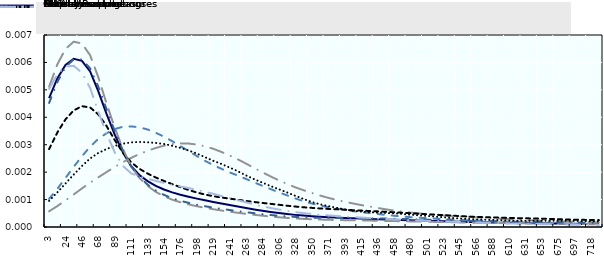
| Category | All ALMPs | Formal training | Non-formal training | Employment measures | MICs | Career consultations | Mobility support | Other measures |
|---|---|---|---|---|---|---|---|---|
| 2.5326633 | 0.005 | 0.001 | 0.001 | 0.003 | 0.005 | 0.005 | 0.001 | 0.005 |
| 13.376884 | 0.005 | 0.001 | 0.001 | 0.003 | 0.006 | 0.005 | 0.001 | 0.006 |
| 24.221106 | 0.006 | 0.002 | 0.001 | 0.004 | 0.006 | 0.006 | 0.002 | 0.006 |
| 35.065327 | 0.006 | 0.002 | 0.001 | 0.004 | 0.007 | 0.006 | 0.002 | 0.006 |
| 45.909548 | 0.006 | 0.003 | 0.001 | 0.004 | 0.007 | 0.006 | 0.002 | 0.006 |
| 56.753769 | 0.006 | 0.003 | 0.002 | 0.004 | 0.006 | 0.006 | 0.002 | 0.005 |
| 67.59799 | 0.005 | 0.003 | 0.002 | 0.004 | 0.005 | 0.005 | 0.003 | 0.004 |
| 78.442211 | 0.004 | 0.003 | 0.002 | 0.004 | 0.005 | 0.004 | 0.003 | 0.003 |
| 89.286432 | 0.003 | 0.004 | 0.002 | 0.003 | 0.004 | 0.003 | 0.003 | 0.003 |
| 100.13065 | 0.003 | 0.004 | 0.002 | 0.003 | 0.003 | 0.003 | 0.003 | 0.002 |
| 110.97487 | 0.002 | 0.004 | 0.003 | 0.002 | 0.002 | 0.002 | 0.003 | 0.002 |
| 121.8191 | 0.002 | 0.004 | 0.003 | 0.002 | 0.002 | 0.002 | 0.003 | 0.002 |
| 132.66332 | 0.002 | 0.004 | 0.003 | 0.002 | 0.002 | 0.002 | 0.003 | 0.002 |
| 143.50754 | 0.001 | 0.003 | 0.003 | 0.002 | 0.001 | 0.001 | 0.003 | 0.002 |
| 154.35176 | 0.001 | 0.003 | 0.003 | 0.002 | 0.001 | 0.001 | 0.003 | 0.002 |
| 165.19598 | 0.001 | 0.003 | 0.003 | 0.002 | 0.001 | 0.001 | 0.003 | 0.002 |
| 176.0402 | 0.001 | 0.003 | 0.003 | 0.001 | 0.001 | 0.001 | 0.003 | 0.001 |
| 186.88442 | 0.001 | 0.003 | 0.003 | 0.001 | 0.001 | 0.001 | 0.003 | 0.001 |
| 197.72864 | 0.001 | 0.003 | 0.003 | 0.001 | 0.001 | 0.001 | 0.003 | 0.001 |
| 208.57286 | 0.001 | 0.002 | 0.003 | 0.001 | 0.001 | 0.001 | 0.003 | 0.001 |
| 219.41709 | 0.001 | 0.002 | 0.003 | 0.001 | 0.001 | 0.001 | 0.002 | 0.001 |
| 230.26131 | 0.001 | 0.002 | 0.003 | 0.001 | 0.001 | 0.001 | 0.002 | 0.001 |
| 241.10553 | 0.001 | 0.002 | 0.003 | 0.001 | 0.001 | 0.001 | 0.002 | 0.001 |
| 251.94975 | 0.001 | 0.002 | 0.002 | 0.001 | 0.001 | 0.001 | 0.002 | 0.001 |
| 262.79397 | 0.001 | 0.002 | 0.002 | 0.001 | 0 | 0.001 | 0.002 | 0.001 |
| 273.63819 | 0.001 | 0.002 | 0.002 | 0.001 | 0 | 0.001 | 0.002 | 0.001 |
| 284.48241 | 0.001 | 0.002 | 0.002 | 0.001 | 0 | 0 | 0.002 | 0.001 |
| 295.32663 | 0.001 | 0.001 | 0.002 | 0.001 | 0 | 0 | 0.001 | 0.001 |
| 306.17085 | 0.001 | 0.001 | 0.002 | 0.001 | 0 | 0 | 0.001 | 0.001 |
| 317.01508 | 0 | 0.001 | 0.002 | 0.001 | 0 | 0 | 0.001 | 0.001 |
| 327.8593 | 0 | 0.001 | 0.001 | 0.001 | 0 | 0 | 0.001 | 0.001 |
| 338.70352 | 0 | 0.001 | 0.001 | 0.001 | 0 | 0 | 0.001 | 0.001 |
| 349.54774 | 0 | 0.001 | 0.001 | 0.001 | 0 | 0 | 0.001 | 0 |
| 360.39196 | 0 | 0.001 | 0.001 | 0.001 | 0 | 0 | 0.001 | 0 |
| 371.23618 | 0 | 0.001 | 0.001 | 0.001 | 0 | 0 | 0.001 | 0 |
| 382.0804 | 0 | 0.001 | 0.001 | 0.001 | 0 | 0 | 0.001 | 0 |
| 392.92462 | 0 | 0.001 | 0.001 | 0.001 | 0 | 0 | 0.001 | 0 |
| 403.76884 | 0 | 0.001 | 0.001 | 0.001 | 0 | 0 | 0.001 | 0 |
| 414.61307 | 0 | 0.001 | 0.001 | 0.001 | 0 | 0 | 0.001 | 0 |
| 425.45729 | 0 | 0.001 | 0.001 | 0.001 | 0 | 0 | 0.001 | 0 |
| 436.30151 | 0 | 0 | 0.001 | 0.001 | 0 | 0 | 0.001 | 0 |
| 447.14573 | 0 | 0 | 0.001 | 0.001 | 0 | 0 | 0.001 | 0 |
| 457.98995 | 0 | 0 | 0.001 | 0.001 | 0 | 0 | 0 | 0 |
| 468.83417 | 0 | 0 | 0.001 | 0.001 | 0 | 0 | 0 | 0 |
| 479.67839 | 0 | 0 | 0.001 | 0.001 | 0 | 0 | 0 | 0 |
| 490.52261 | 0 | 0 | 0 | 0 | 0 | 0 | 0 | 0 |
| 501.36683 | 0 | 0 | 0 | 0 | 0 | 0 | 0 | 0 |
| 512.21106 | 0 | 0 | 0 | 0 | 0 | 0 | 0 | 0 |
| 523.05528 | 0 | 0 | 0 | 0 | 0 | 0 | 0 | 0 |
| 533.8995 | 0 | 0 | 0 | 0 | 0 | 0 | 0 | 0 |
| 544.74372 | 0 | 0 | 0 | 0 | 0 | 0 | 0 | 0 |
| 555.58794 | 0 | 0 | 0 | 0 | 0 | 0 | 0 | 0 |
| 566.43216 | 0 | 0 | 0 | 0 | 0 | 0 | 0 | 0 |
| 577.27638 | 0 | 0 | 0 | 0 | 0 | 0 | 0 | 0 |
| 588.1206 | 0 | 0 | 0 | 0 | 0 | 0 | 0 | 0 |
| 598.96482 | 0 | 0 | 0 | 0 | 0 | 0 | 0 | 0 |
| 609.80905 | 0 | 0 | 0 | 0 | 0 | 0 | 0 | 0 |
| 620.65327 | 0 | 0 | 0 | 0 | 0 | 0 | 0 | 0 |
| 631.49749 | 0 | 0 | 0 | 0 | 0 | 0 | 0 | 0 |
| 642.34171 | 0 | 0 | 0 | 0 | 0 | 0 | 0 | 0 |
| 653.18593 | 0 | 0 | 0 | 0 | 0 | 0 | 0 | 0 |
| 664.03015 | 0 | 0 | 0 | 0 | 0 | 0 | 0 | 0 |
| 674.87437 | 0 | 0 | 0 | 0 | 0 | 0 | 0 | 0 |
| 685.71859 | 0 | 0 | 0 | 0 | 0 | 0 | 0 | 0 |
| 696.56281 | 0 | 0 | 0 | 0 | 0 | 0 | 0 | 0 |
| 707.40704 | 0 | 0 | 0 | 0 | 0 | 0 | 0 | 0 |
| 718.25126 | 0 | 0 | 0 | 0 | 0 | 0 | 0 | 0 |
| 729.09548 | 0 | 0 | 0 | 0 | 0 | 0 | 0 | 0 |